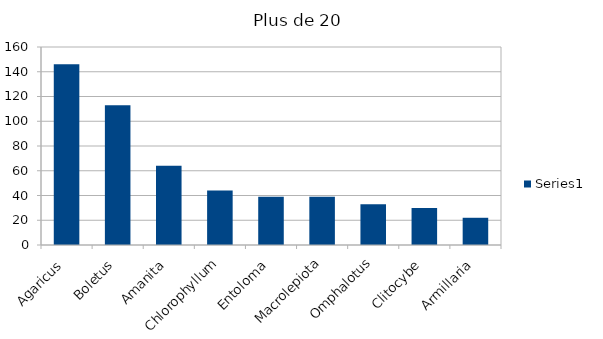
| Category | Series 0 |
|---|---|
| Agaricus  | 146 |
| Boletus | 113 |
| Amanita | 64 |
| Chlorophyllum | 44 |
| Entoloma | 39 |
| Macrolepiota | 39 |
| Omphalotus | 33 |
| Clitocybe | 30 |
| Armillaria | 22 |